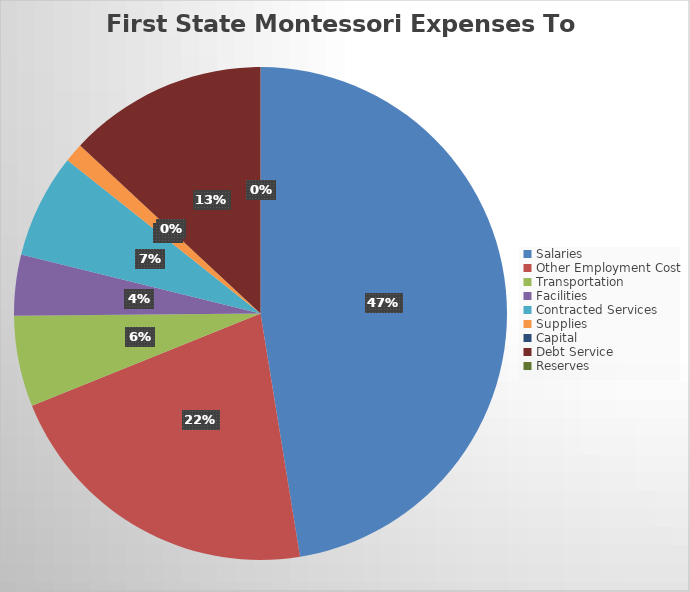
| Category | Series 0 |
|---|---|
| Salaries | 2791841.42 |
| Other Employment Cost | 1262472.56 |
| Transportation | 351281.58 |
| Facilities | 234785.09 |
| Contracted Services | 402192.5 |
| Supplies | 74077.91 |
| Capital | 0 |
| Debt Service | 768822.52 |
| Reserves | 0 |